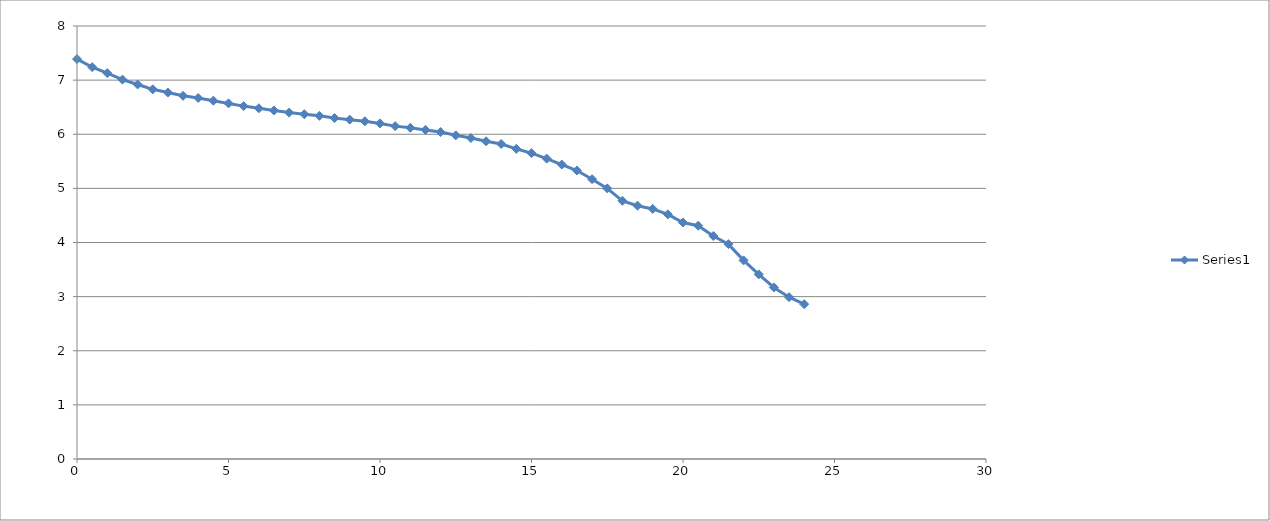
| Category | Series 0 |
|---|---|
| 0.0 | 7.39 |
| 0.5 | 7.24 |
| 1.0 | 7.13 |
| 1.5 | 7.01 |
| 2.0 | 6.92 |
| 2.5 | 6.83 |
| 3.0 | 6.77 |
| 3.5 | 6.71 |
| 4.0 | 6.67 |
| 4.5 | 6.62 |
| 5.0 | 6.57 |
| 5.5 | 6.52 |
| 6.0 | 6.48 |
| 6.5 | 6.44 |
| 7.0 | 6.4 |
| 7.5 | 6.37 |
| 8.0 | 6.34 |
| 8.5 | 6.3 |
| 9.0 | 6.27 |
| 9.5 | 6.24 |
| 10.0 | 6.2 |
| 10.5 | 6.15 |
| 11.0 | 6.12 |
| 11.5 | 6.08 |
| 12.0 | 6.04 |
| 12.5 | 5.98 |
| 13.0 | 5.93 |
| 13.5 | 5.87 |
| 14.0 | 5.82 |
| 14.5 | 5.73 |
| 15.0 | 5.65 |
| 15.5 | 5.55 |
| 16.0 | 5.44 |
| 16.5 | 5.33 |
| 17.0 | 5.17 |
| 17.5 | 5 |
| 18.0 | 4.77 |
| 18.5 | 4.68 |
| 19.0 | 4.62 |
| 19.5 | 4.52 |
| 20.0 | 4.37 |
| 20.5 | 4.31 |
| 21.0 | 4.12 |
| 21.5 | 3.97 |
| 22.0 | 3.67 |
| 22.5 | 3.41 |
| 23.0 | 3.17 |
| 23.5 | 2.99 |
| 24.0 | 2.86 |